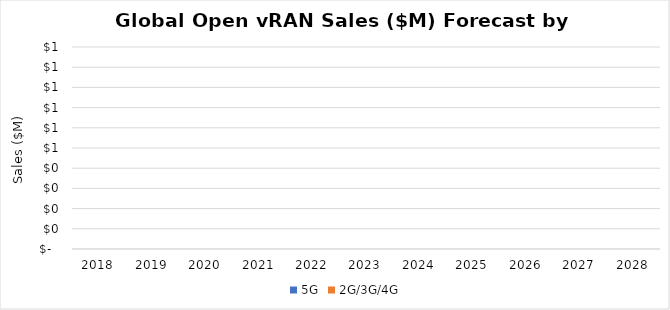
| Category | 5G | 2G/3G/4G |
|---|---|---|
| 2018.0 | 0 | 0 |
| 2019.0 | 0 | 0 |
| 2020.0 | 0 | 0 |
| 2021.0 | 0 | 0 |
| 2022.0 | 0 | 0 |
| 2023.0 | 0 | 0 |
| 2024.0 | 0 | 0 |
| 2025.0 | 0 | 0 |
| 2026.0 | 0 | 0 |
| 2027.0 | 0 | 0 |
| 2028.0 | 0 | 0 |